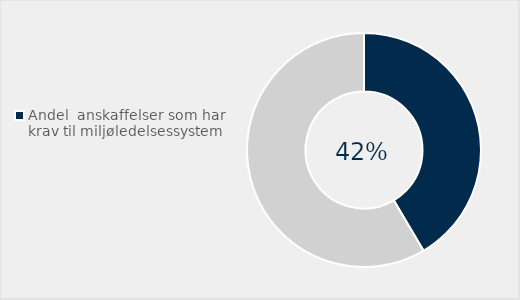
| Category | Series 0 |
|---|---|
| Andel  anskaffelser som har krav til miljøledelsessystem | 0.415 |
| Ikke brukt miljøledelsessystem | 0.585 |